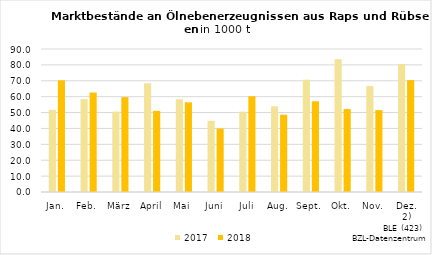
| Category | 2017 | 2018 |
|---|---|---|
| Jan. | 51.687 | 70.279 |
| Feb. | 58.457 | 62.604 |
| März | 50.595 | 59.708 |
| April | 68.396 | 51.063 |
| Mai | 58.382 | 56.441 |
| Juni | 44.749 | 39.945 |
| Juli | 50.587 | 60.246 |
| Aug. | 53.933 | 48.648 |
| Sept. | 70.647 | 57.109 |
| Okt. | 83.623 | 52.205 |
| Nov. | 66.672 | 51.535 |
| Dez. 2) | 80.579 | 70.409 |